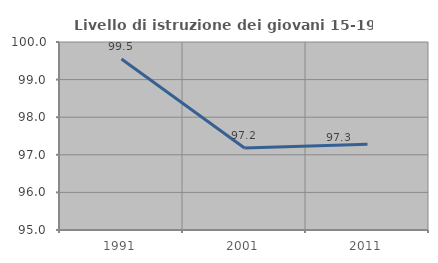
| Category | Livello di istruzione dei giovani 15-19 anni |
|---|---|
| 1991.0 | 99.55 |
| 2001.0 | 97.183 |
| 2011.0 | 97.283 |